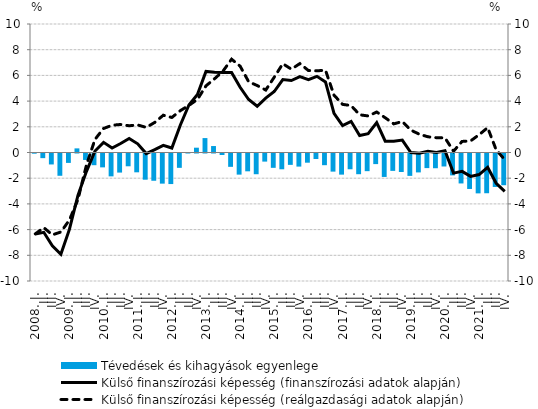
| Category | Tévedések és kihagyások egyenlege |
|---|---|
| 2008. I. | -0.014 |
| II. | -0.361 |
| III. | -0.853 |
| IV. | -1.734 |
| 2009. I. | -0.732 |
| II. | 0.321 |
| III. | -0.502 |
| IV. | -0.91 |
| 2010. I. | -1.079 |
| II. | -1.78 |
| III. | -1.485 |
| IV. | -0.995 |
| 2011. I. | -1.464 |
| II. | -2.039 |
| III. | -2.121 |
| IV. | -2.345 |
| 2012. I. | -2.378 |
| II. | -1.116 |
| III. | 0.036 |
| IV. | 0.375 |
| 2013. I. | 1.122 |
| II. | 0.503 |
| III. | -0.116 |
| IV. | -1.038 |
| 2014. I. | -1.644 |
| II. | -1.387 |
| III. | -1.613 |
| IV. | -0.631 |
| 2015. I. | -1.115 |
| II. | -1.228 |
| III. | -0.885 |
| IV. | -1.019 |
| 2016. I. | -0.715 |
| II. | -0.428 |
| III. | -0.909 |
| IV. | -1.41 |
| 2017. I. | -1.644 |
| II. | -1.227 |
| III. | -1.612 |
| IV. | -1.375 |
| 2018. I. | -0.825 |
| II. | -1.825 |
| III. | -1.352 |
| IV. | -1.44 |
| 2019. I. | -1.742 |
| II. | -1.472 |
| III. | -1.136 |
| IV. | -1.147 |
| 2020. I. | -1.01 |
| II. | -1.704 |
| III. | -2.331 |
| IV. | -2.76 |
| 2021. I. | -3.103 |
| II. | -3.092 |
| III. | -2.604 |
| IV. | -2.468 |